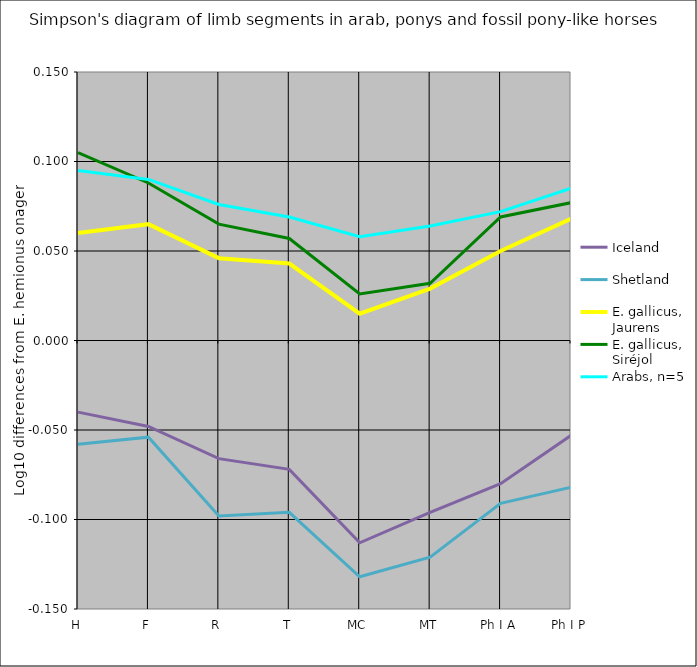
| Category | Iceland | Shetland | E. gallicus, Jaurens | E. gallicus, Siréjol | Arabs, n=5 |
|---|---|---|---|---|---|
| H | -0.04 | -0.058 | 0.06 | 0.105 | 0.095 |
| F | -0.048 | -0.054 | 0.065 | 0.088 | 0.09 |
| R | -0.066 | -0.098 | 0.046 | 0.065 | 0.076 |
| T | -0.072 | -0.096 | 0.043 | 0.057 | 0.069 |
| MC | -0.113 | -0.132 | 0.015 | 0.026 | 0.058 |
| MT | -0.096 | -0.121 | 0.029 | 0.032 | 0.064 |
| Ph I A | -0.08 | -0.091 | 0.05 | 0.069 | 0.072 |
| Ph I P | -0.053 | -0.082 | 0.068 | 0.077 | 0.085 |